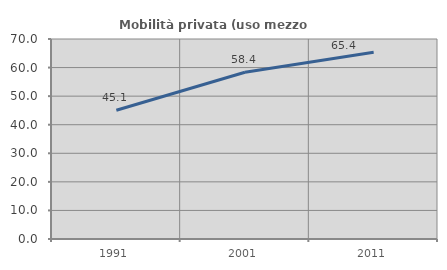
| Category | Mobilità privata (uso mezzo privato) |
|---|---|
| 1991.0 | 45.083 |
| 2001.0 | 58.363 |
| 2011.0 | 65.379 |